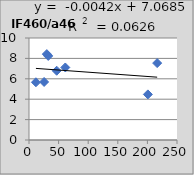
| Category | IF460/a460 |
|---|---|
| 25.5 | 5.69 |
| 61.3 | 7.11 |
| 11.7 | 5.66 |
| 216.5 | 7.54 |
| 46.8 | 6.79 |
| 32.5 | 8.24 |
| 200.8 | 4.47 |
| 30.1 | 8.42 |